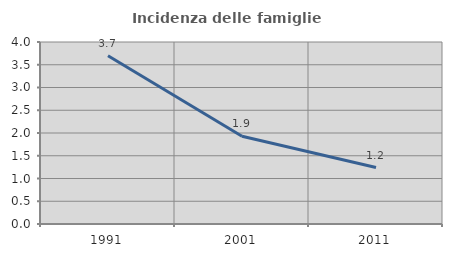
| Category | Incidenza delle famiglie numerose |
|---|---|
| 1991.0 | 3.697 |
| 2001.0 | 1.929 |
| 2011.0 | 1.241 |